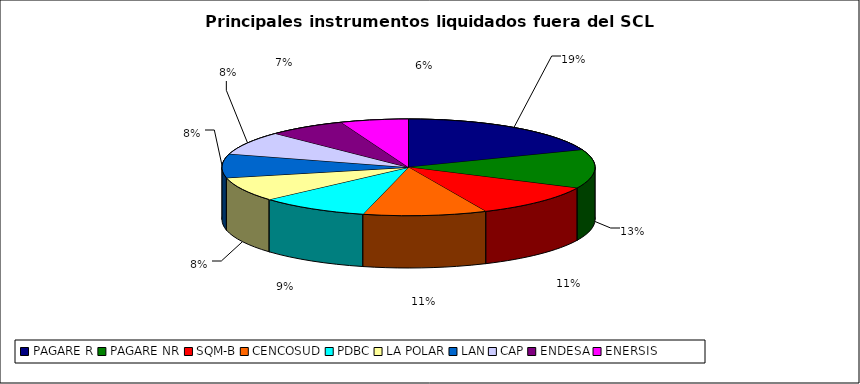
| Category | Series 0 |
|---|---|
| PAGARE R | 4593 |
| PAGARE NR | 3108 |
| SQM-B | 2676 |
| CENCOSUD | 2574 |
| PDBC | 2280 |
| LA POLAR | 1945 |
| LAN | 1918 |
| CAP | 1884 |
| ENDESA | 1624 |
| ENERSIS | 1413 |